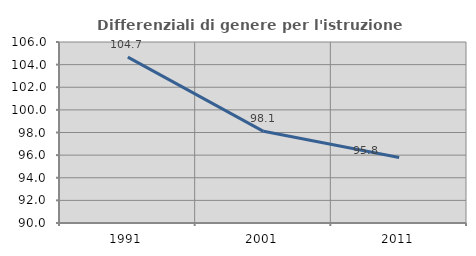
| Category | Differenziali di genere per l'istruzione superiore |
|---|---|
| 1991.0 | 104.661 |
| 2001.0 | 98.102 |
| 2011.0 | 95.791 |